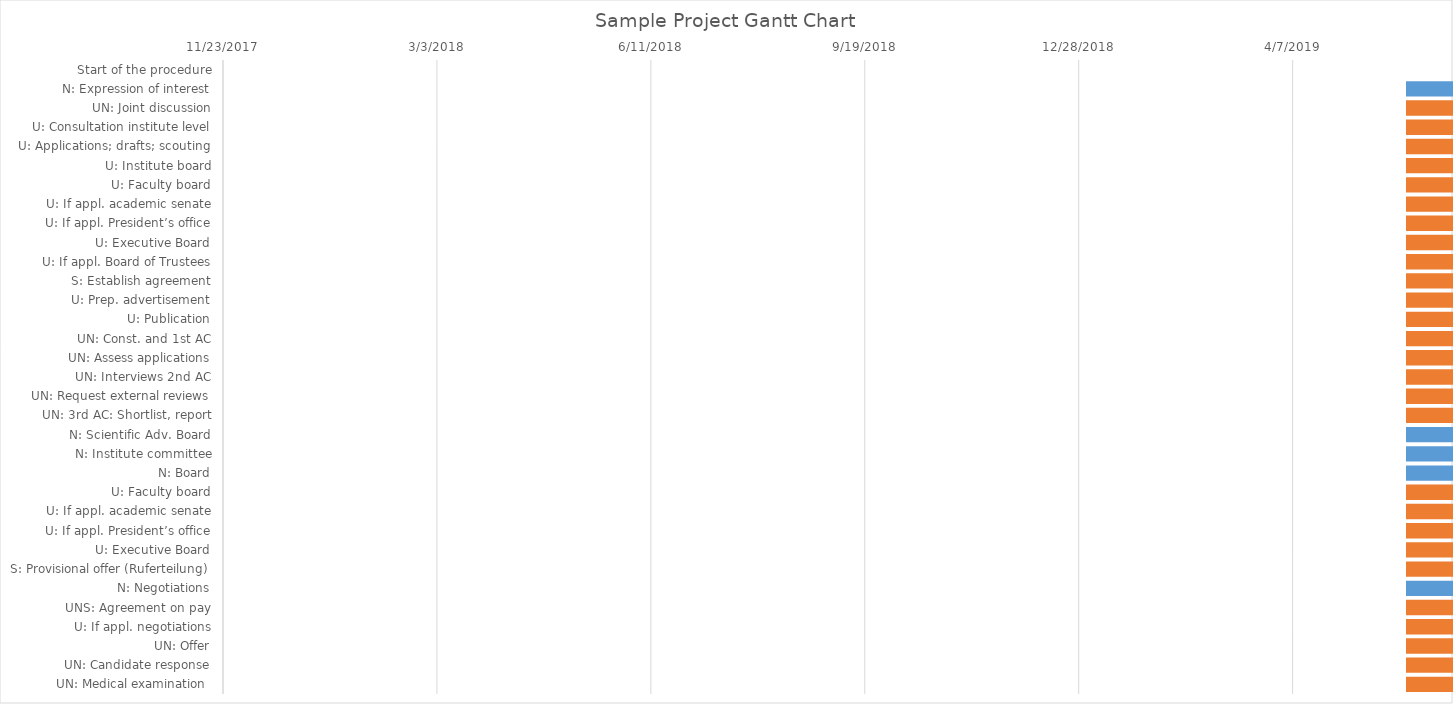
| Category | Start Dates | Duration |
|---|---|---|
| Start of the procedure | 1/6/21 | 0 |
| N: Expression of interest | 1/6/21 | 7 |
| UN: Joint discussion | 1/13/21 | 14 |
| U: Consultation institute level | 1/27/21 | 14 |
| U: Applications; drafts; scouting | 2/10/21 | 28 |
| U: Institute board | 3/10/21 | 14 |
| U: Faculty board | 3/24/21 | 14 |
| U: If appl. academic senate | 4/7/21 | 21 |
| U: If appl. President’s office | 4/7/21 | 21 |
| U: Executive Board | 4/21/21 | 14 |
| U: If appl. Board of Trustees | 5/5/21 | 28 |
| S: Establish agreement | 6/2/21 | 28 |
| U: Prep. advertisement | 6/2/21 | 28 |
| U: Publication | 6/30/21 | 28 |
| UN: Const. and 1st AC | 6/30/21 | 28 |
| UN: Assess applications | 7/28/21 | 14 |
| UN: Interviews 2nd AC | 7/28/21 | 28 |
| UN: Request external reviews | 8/25/21 | 70 |
| UN: 3rd AC: Shortlist, report | 11/3/21 | 28 |
| N: Scientific Adv. Board | 12/1/21 | 28 |
| N: Institute committee | 12/29/21 | 14 |
| N: Board | 1/12/22 | 7 |
| U: Faculty board | 12/8/21 | 14 |
| U: If appl. academic senate | 12/22/21 | 21 |
| U: If appl. President’s office | 12/22/21 | 21 |
| U: Executive Board | 1/5/22 | 14 |
| S: Provisional offer (Ruferteilung) | 1/19/22 | 28 |
| N: Negotiations | 2/16/22 | 7 |
| UNS: Agreement on pay | 2/23/22 | 28 |
| U: If appl. negotiations | 3/9/22 | 28 |
| UN: Offer | 4/6/22 | 7 |
| UN: Candidate response | 4/13/22 | 28 |
| UN: Medical examination  | 4/13/22 | 42 |